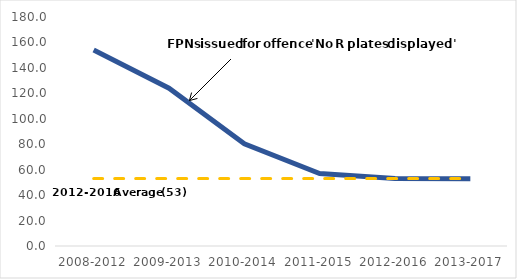
| Category | Series 0 | Series 1 |
|---|---|---|
| 2008-2012 | 154 | 53 |
| 2009-2013 | 124 | 53 |
| 2010-2014 | 80.4 | 53 |
| 2011-2015 | 57 | 53 |
| 2012-2016 | 53 | 53 |
| 2013-2017 | 52.8 | 53 |